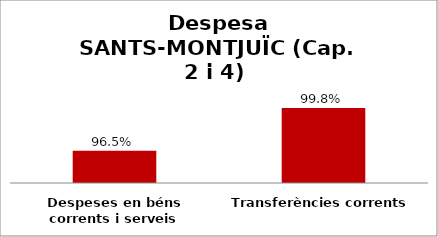
| Category | Series 0 |
|---|---|
| Despeses en béns corrents i serveis | 0.965 |
| Transferències corrents | 0.998 |